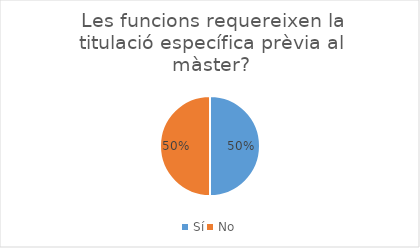
| Category | Series 0 |
|---|---|
| Sí | 1 |
| No | 1 |